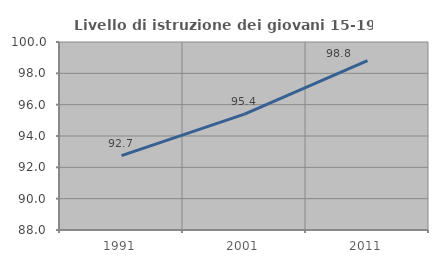
| Category | Livello di istruzione dei giovani 15-19 anni |
|---|---|
| 1991.0 | 92.748 |
| 2001.0 | 95.396 |
| 2011.0 | 98.81 |